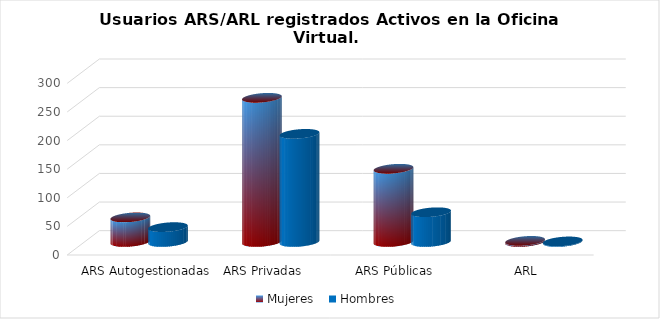
| Category | Mujeres | Hombres |
|---|---|---|
| ARS Autogestionadas | 43 | 26 |
| ARS Privadas | 252 | 189 |
| ARS Públicas | 128 | 52 |
| ARL | 2 | 1 |